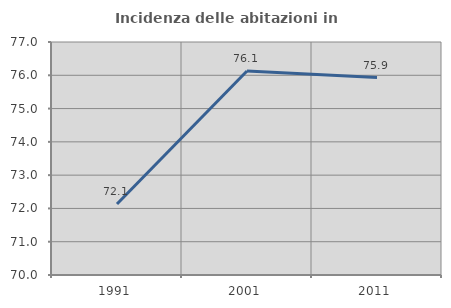
| Category | Incidenza delle abitazioni in proprietà  |
|---|---|
| 1991.0 | 72.133 |
| 2001.0 | 76.127 |
| 2011.0 | 75.932 |